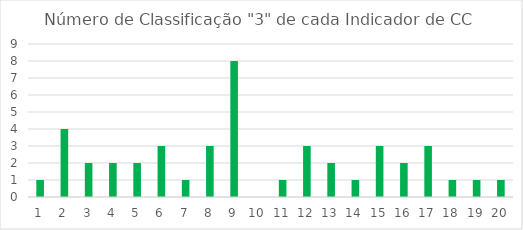
| Category | Series 0 |
|---|---|
| 0 | 1 |
| 1 | 4 |
| 2 | 2 |
| 3 | 2 |
| 4 | 2 |
| 5 | 3 |
| 6 | 1 |
| 7 | 3 |
| 8 | 8 |
| 9 | 0 |
| 10 | 1 |
| 11 | 3 |
| 12 | 2 |
| 13 | 1 |
| 14 | 3 |
| 15 | 2 |
| 16 | 3 |
| 17 | 1 |
| 18 | 1 |
| 19 | 1 |